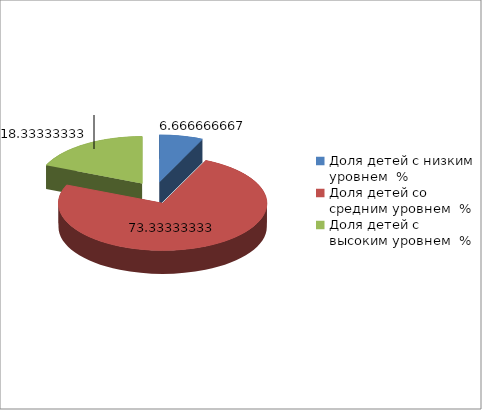
| Category | Series 0 |
|---|---|
| Доля детей с низким уровнем  % | 6.667 |
| Доля детей со средним уровнем  % | 73.333 |
| Доля детей с высоким уровнем  % | 18.333 |